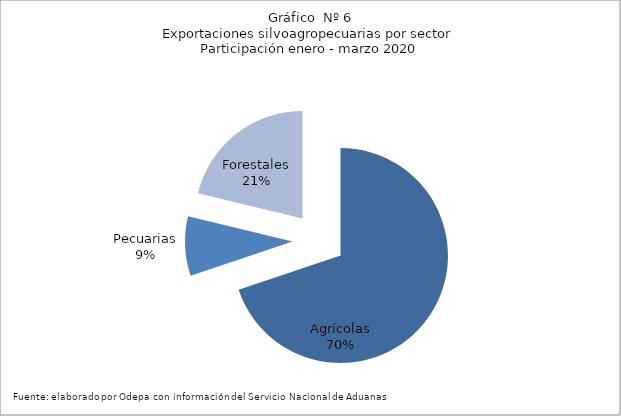
| Category | Series 0 |
|---|---|
| Agrícolas | 2195006 |
| Pecuarias | 281614 |
| Forestales | 667055 |